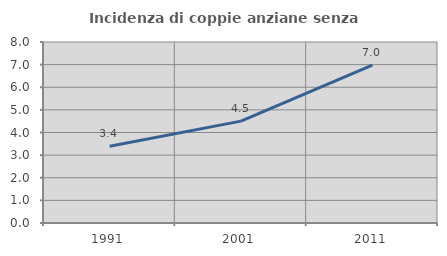
| Category | Incidenza di coppie anziane senza figli  |
|---|---|
| 1991.0 | 3.394 |
| 2001.0 | 4.502 |
| 2011.0 | 6.979 |